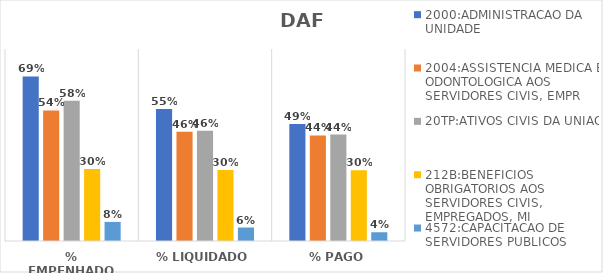
| Category | 2000:ADMINISTRACAO DA UNIDADE | 2004:ASSISTENCIA MEDICA E ODONTOLOGICA AOS SERVIDORES CIVIS, EMPR | 20TP:ATIVOS CIVIS DA UNIAO | 212B:BENEFICIOS OBRIGATORIOS AOS SERVIDORES CIVIS, EMPREGADOS, MI | 4572:CAPACITACAO DE SERVIDORES PUBLICOS FEDERAIS EM PROCESSO DE Q |
|---|---|---|---|---|---|
| % EMPENHADO | 0.686 | 0.544 | 0.584 | 0.3 | 0.08 |
| % LIQUIDADO | 0.55 | 0.456 | 0.46 | 0.296 | 0.056 |
| % PAGO | 0.488 | 0.44 | 0.444 | 0.295 | 0.037 |